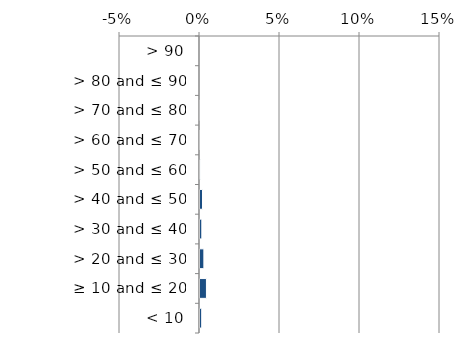
| Category | Near native & fragments |
|---|---|
|  < 10 | 0.002 |
|  ≥ 10 and ≤ 20 | 0.005 |
|  > 20 and ≤ 30 | 0.003 |
|  > 30 and ≤ 40 | 0.002 |
|  > 40 and ≤ 50 | 0.002 |
|  > 50 and ≤ 60 | 0.001 |
|  > 60 and ≤ 70 | 0 |
|  > 70 and ≤ 80 | 0 |
|  > 80 and ≤ 90 | 0 |
|  > 90 | 0 |